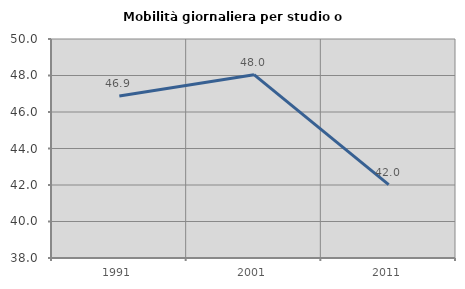
| Category | Mobilità giornaliera per studio o lavoro |
|---|---|
| 1991.0 | 46.877 |
| 2001.0 | 48.044 |
| 2011.0 | 42.017 |